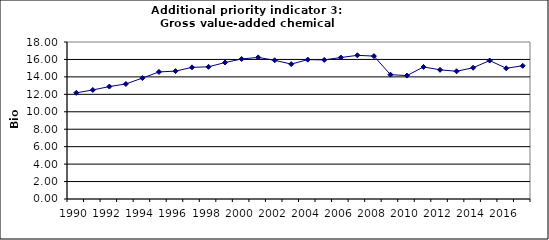
| Category | Gross value-added chemical industry, Bio Euro (EC95) |
|---|---|
| 1990 | 12.171 |
| 1991 | 12.501 |
| 1992 | 12.89 |
| 1993 | 13.19 |
| 1994 | 13.865 |
| 1995 | 14.569 |
| 1996 | 14.659 |
| 1997 | 15.094 |
| 1998 | 15.154 |
| 1999 | 15.648 |
| 2000 | 16.053 |
| 2001 | 16.233 |
| 2002 | 15.903 |
| 2003 | 15.468 |
| 2004 | 15.978 |
| 2005 | 15.948 |
| 2006 | 16.218 |
| 2007 | 16.473 |
| 2008 | 16.383 |
| 2009 | 14.254 |
| 2010 | 14.149 |
| 2011 | 15.139 |
| 2012 | 14.809 |
| 2013 | 14.644 |
| 2014 | 15.049 |
| 2015 | 15.873 |
| 2016 | 14.989 |
| 2017 | 15.274 |